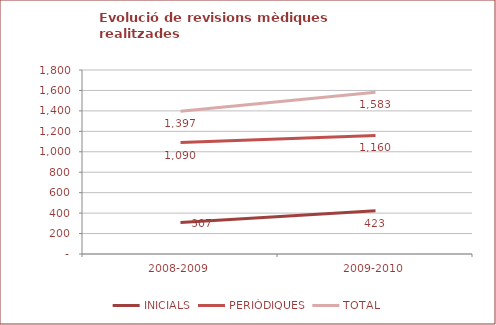
| Category | INICIALS | PERIÒDIQUES | TOTAL |
|---|---|---|---|
| 0 | 307 | 1090 | 1397 |
| 1 | 423 | 1160 | 1583 |